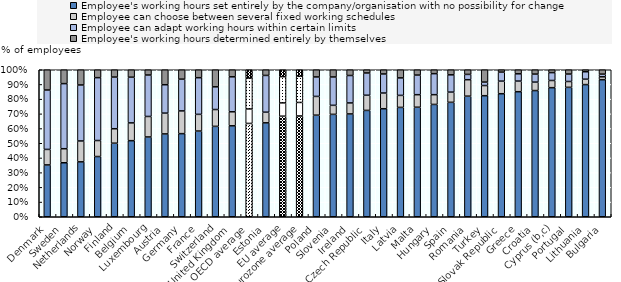
| Category | Employee's working hours set entirely by the company/organisation with no possibility for change | Employee can choose between several fixed working schedules | Employee can adapt working hours within certain limits | Employee's working hours determined entirely by themselves |
|---|---|---|---|---|
| Denmark | 0.353 | 0.105 | 0.404 | 0.138 |
| Sweden | 0.367 | 0.096 | 0.443 | 0.094 |
| Netherlands | 0.373 | 0.142 | 0.381 | 0.104 |
| Norway | 0.41 | 0.109 | 0.428 | 0.054 |
| Finland | 0.5 | 0.098 | 0.351 | 0.05 |
| Belgium | 0.518 | 0.121 | 0.311 | 0.051 |
| Luxembourg | 0.543 | 0.14 | 0.282 | 0.036 |
| Austria | 0.564 | 0.141 | 0.193 | 0.102 |
| Germany | 0.565 | 0.155 | 0.216 | 0.064 |
| France | 0.583 | 0.114 | 0.249 | 0.054 |
| Switzerland | 0.615 | 0.114 | 0.154 | 0.116 |
| United Kingdom | 0.619 | 0.095 | 0.238 | 0.048 |
| OECD average | 0.635 | 0.098 | 0.21 | 0.056 |
| Estonia | 0.639 | 0.072 | 0.25 | 0.039 |
| EU average | 0.684 | 0.09 | 0.179 | 0.047 |
| Eurozone average | 0.686 | 0.092 | 0.178 | 0.045 |
| Poland | 0.691 | 0.128 | 0.133 | 0.049 |
| Slovenia | 0.697 | 0.061 | 0.193 | 0.049 |
| Ireland | 0.699 | 0.075 | 0.187 | 0.039 |
| Czech Republic | 0.724 | 0.103 | 0.151 | 0.022 |
| Italy | 0.735 | 0.107 | 0.13 | 0.029 |
| Latvia | 0.744 | 0.082 | 0.119 | 0.055 |
| Malta | 0.745 | 0.085 | 0.133 | 0.036 |
| Hungary | 0.764 | 0.066 | 0.143 | 0.027 |
| Spain | 0.778 | 0.069 | 0.118 | 0.035 |
| Romania | 0.82 | 0.112 | 0.036 | 0.032 |
| Turkey | 0.824 | 0.069 | 0.024 | 0.084 |
| Slovak Republic | 0.837 | 0.085 | 0.061 | 0.016 |
| Greece | 0.851 | 0.072 | 0.049 | 0.028 |
| Croatia | 0.858 | 0.057 | 0.054 | 0.03 |
| Cyprus (b,c) | 0.878 | 0.049 | 0.053 | 0.02 |
| Portugal | 0.88 | 0.04 | 0.051 | 0.029 |
| Lithuania | 0.899 | 0.037 | 0.051 | 0.014 |
| Bulgaria | 0.932 | 0.02 | 0.018 | 0.03 |